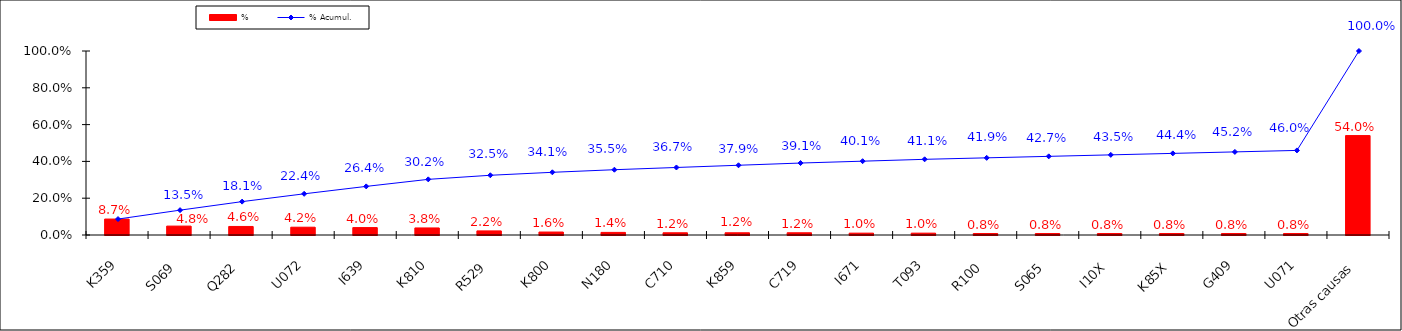
| Category | % |
|---|---|
| K359 | 0.087 |
| S069 | 0.048 |
| Q282 | 0.046 |
| U072 | 0.042 |
| I639 | 0.04 |
| K810 | 0.038 |
| R529 | 0.022 |
| K800 | 0.016 |
| N180 | 0.014 |
| C710 | 0.012 |
| K859 | 0.012 |
| C719 | 0.012 |
| I671 | 0.01 |
| T093 | 0.01 |
| R100 | 0.008 |
| S065 | 0.008 |
| I10X | 0.008 |
| K85X | 0.008 |
| G409 | 0.008 |
| U071 | 0.008 |
| Otras causas | 0.54 |